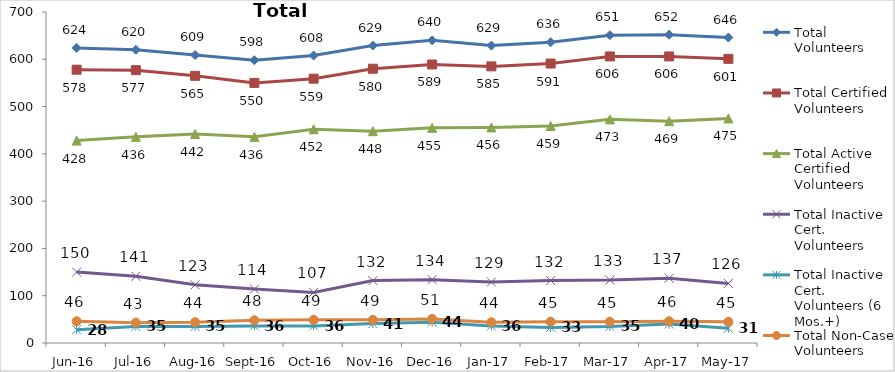
| Category | Total Volunteers | Total Certified Volunteers | Total Active Certified Volunteers | Total Inactive Cert. Volunteers | Total Inactive Cert. Volunteers (6 Mos.+) | Total Non-Case Volunteers |
|---|---|---|---|---|---|---|
| Jun-16 | 624 | 578 | 428 | 150 | 28 | 46 |
| Jul-16 | 620 | 577 | 436 | 141 | 35 | 43 |
| Aug-16 | 609 | 565 | 442 | 123 | 35 | 44 |
| Sep-16 | 598 | 550 | 436 | 114 | 36 | 48 |
| Oct-16 | 608 | 559 | 452 | 107 | 36 | 49 |
| Nov-16 | 629 | 580 | 448 | 132 | 41 | 49 |
| Dec-16 | 640 | 589 | 455 | 134 | 44 | 51 |
| Jan-17 | 629 | 585 | 456 | 129 | 36 | 44 |
| Feb-17 | 636 | 591 | 459 | 132 | 33 | 45 |
| Mar-17 | 651 | 606 | 473 | 133 | 35 | 45 |
| Apr-17 | 652 | 606 | 469 | 137 | 40 | 46 |
| May-17 | 646 | 601 | 475 | 126 | 31 | 45 |